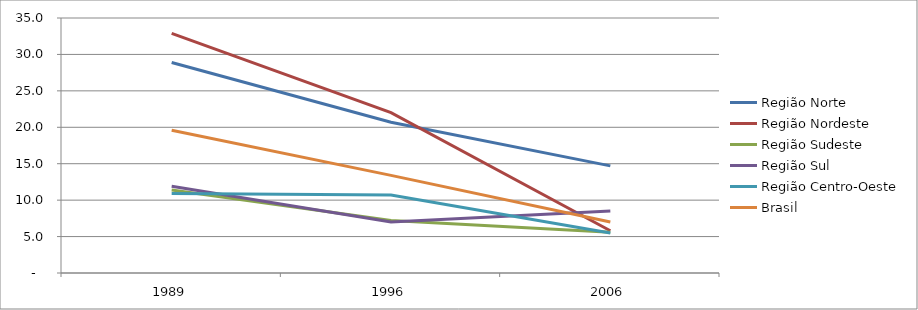
| Category | Região Norte | Região Nordeste | Região Sudeste | Região Sul | Região Centro-Oeste | Brasil |
|---|---|---|---|---|---|---|
| 1989.0 | 28.9 | 32.9 | 11.4 | 11.9 | 10.9 | 19.6 |
| 1996.0 | 20.7 | 22 | 7.2 | 7 | 10.7 | 13.4 |
| 2006.0 | 14.7 | 5.8 | 5.6 | 8.5 | 5.5 | 7 |